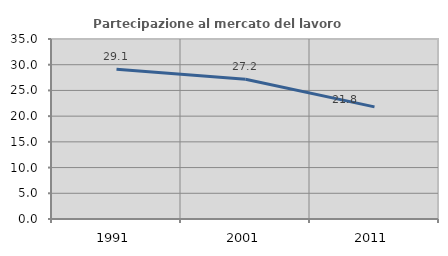
| Category | Partecipazione al mercato del lavoro  femminile |
|---|---|
| 1991.0 | 29.124 |
| 2001.0 | 27.16 |
| 2011.0 | 21.8 |